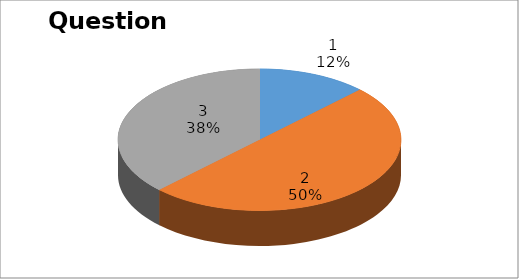
| Category | Series 0 |
|---|---|
| 0 | 1 |
| 1 | 4 |
| 2 | 3 |